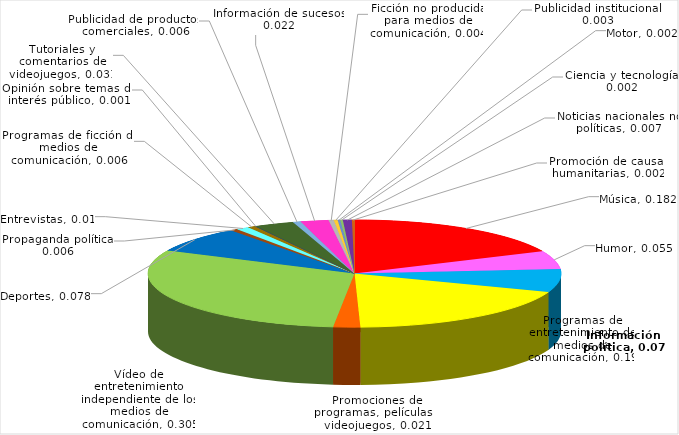
| Category | Series 0 |
|---|---|
| Música | 0.182 |
| Humor | 0.055 |
| Información política | 0.07 |
| Programas de entretenimiento de medios de comunicación | 0.19 |
| Promociones de programas, películas o videojuegos | 0.021 |
| Vídeo de entretenimiento independiente de los medios de comunicación | 0.305 |
| Deportes | 0.078 |
| Propaganda política | 0.006 |
| Entrevistas | 0.01 |
| Programas de ficción de medios de comunicación | 0.006 |
| Opinión sobre temas de interés público | 0.001 |
| Tutoriales y comentarios de videojuegos | 0.031 |
| Publicidad de productos comerciales | 0.006 |
| Información de sucesos | 0.022 |
| Ficción no producida para medios de comunicación | 0.004 |
| Publicidad institucional | 0.003 |
| Motor | 0.002 |
| Ciencia y tecnología | 0.002 |
| Noticias nacionales no políticas | 0.007 |
| Promoción de causas humanitarias | 0.002 |